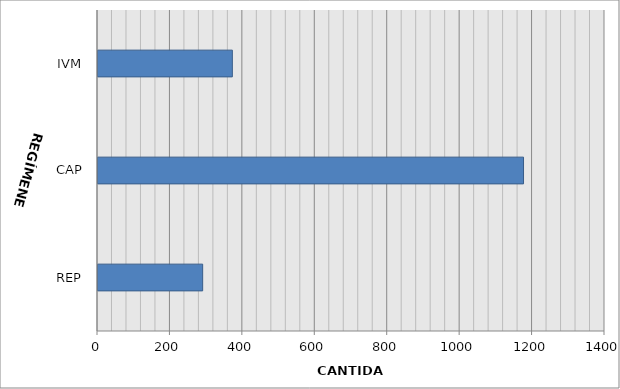
| Category | Series 0 |
|---|---|
| REP | 289 |
| CAP | 1175 |
| IVM | 371 |